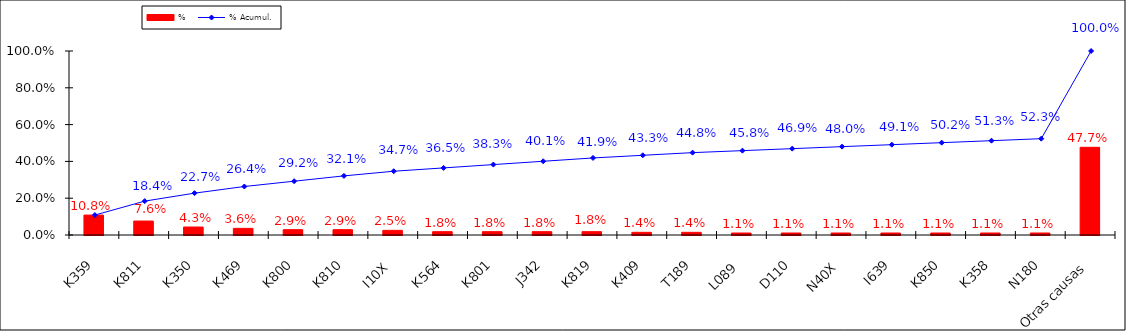
| Category | % |
|---|---|
| K359 | 0.108 |
| K811 | 0.076 |
| K350 | 0.043 |
| K469 | 0.036 |
| K800 | 0.029 |
| K810 | 0.029 |
| I10X | 0.025 |
| K564 | 0.018 |
| K801 | 0.018 |
| J342 | 0.018 |
| K819 | 0.018 |
| K409 | 0.014 |
| T189 | 0.014 |
| L089 | 0.011 |
| D110 | 0.011 |
| N40X | 0.011 |
| I639 | 0.011 |
| K850 | 0.011 |
| K358 | 0.011 |
| N180 | 0.011 |
| Otras causas | 0.477 |